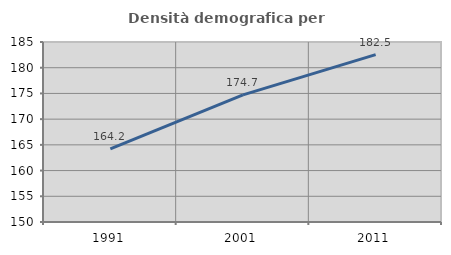
| Category | Densità demografica |
|---|---|
| 1991.0 | 164.218 |
| 2001.0 | 174.713 |
| 2011.0 | 182.546 |